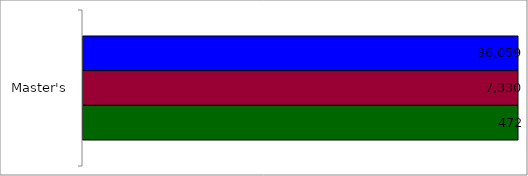
| Category | 50 states and D.C. | SREB states | State |
|---|---|---|---|
| Master's | 36059 | 7330 | 472 |